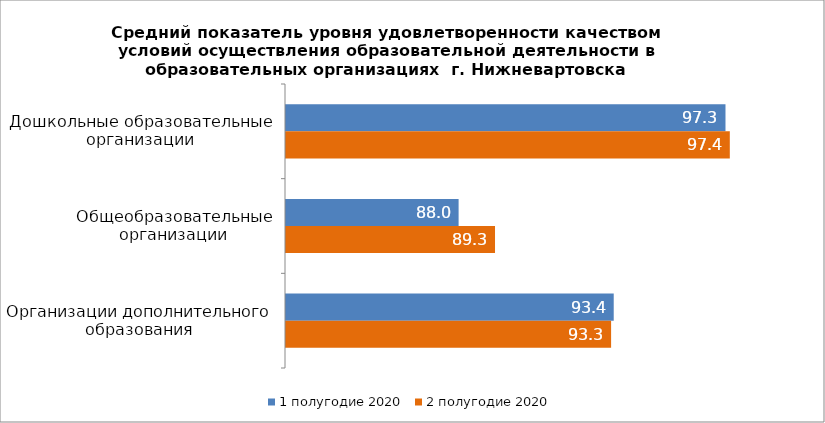
| Category | 1 полугодие 2020 | 2 полугодие 2020 |
|---|---|---|
| Дошкольные образовательные организации | 97.272 | 97.422 |
| Общеобразовательные организации | 87.998 | 89.263 |
| Организации дополнительного образования | 93.388 | 93.297 |